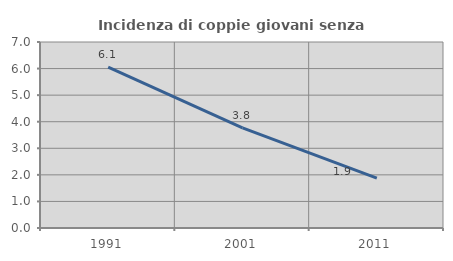
| Category | Incidenza di coppie giovani senza figli |
|---|---|
| 1991.0 | 6.052 |
| 2001.0 | 3.77 |
| 2011.0 | 1.874 |